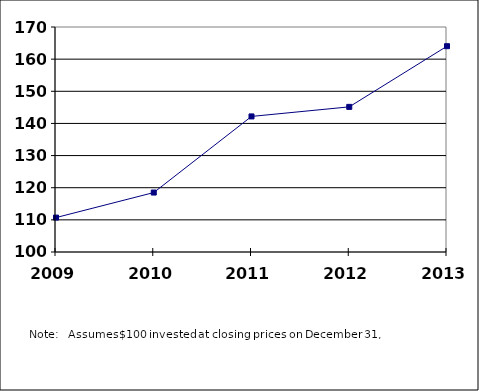
| Category |  100.00  |
|---|---|
| 2009.0 | 110.707 |
| 2010.0 | 118.495 |
| 2011.0 | 142.179 |
| 2012.0 | 145.15 |
| 2013.0 | 164.03 |